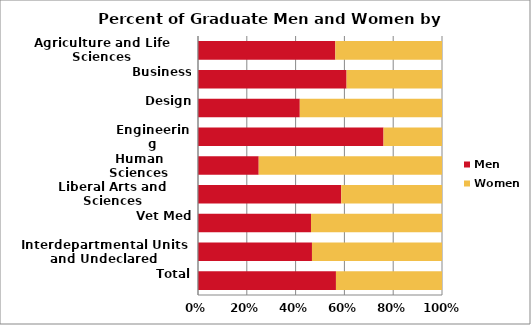
| Category | Men | Women |
|---|---|---|
| Agriculture and Life Sciences | 367 | 285 |
| Business | 204 | 131 |
| Design | 68 | 95 |
| Engineering | 898 | 283 |
| Human Sciences | 154 | 465 |
| Liberal Arts and Sciences | 634 | 446 |
| Vet Med | 69 | 80 |
| Interdepartmental Units and Undeclared | 149 | 170 |
| Total | 2543 | 1955 |